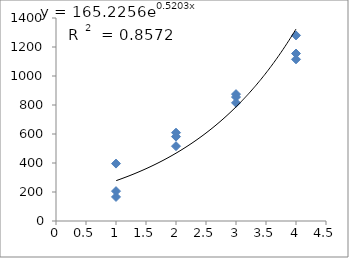
| Category | Series 0 |
|---|---|
| 1.0 | 166 |
| 1.0 | 206 |
| 1.0 | 396 |
| 2.0 | 516 |
| 2.0 | 609 |
| 2.0 | 582 |
| 3.0 | 875 |
| 3.0 | 855 |
| 3.0 | 815 |
| 4.0 | 1115 |
| 4.0 | 1155 |
| 4.0 | 1280 |